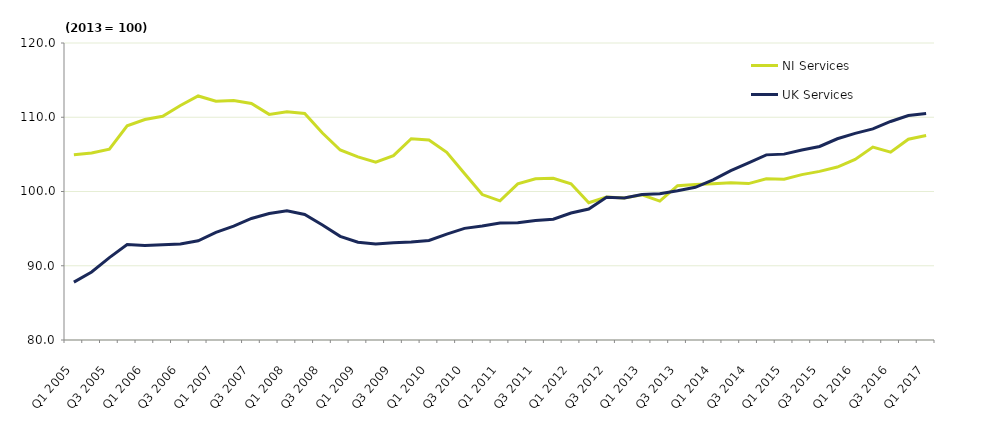
| Category | NI Services | UK Services |
|---|---|---|
| Q1 2005 | 104.955 | 87.8 |
| Q2 2005 | 105.184 | 89.167 |
| Q3 2005 | 105.7 | 91.1 |
| Q4 2005 | 108.843 | 92.867 |
| Q1 2006 | 109.689 | 92.733 |
| Q2 2006 | 110.137 | 92.833 |
| Q3 2006 | 111.588 | 92.933 |
| Q4 2006 | 112.865 | 93.367 |
| Q1 2007 | 112.163 | 94.5 |
| Q2 2007 | 112.244 | 95.333 |
| Q3 2007 | 111.863 | 96.367 |
| Q4 2007 | 110.384 | 97.033 |
| Q1 2008 | 110.753 | 97.4 |
| Q2 2008 | 110.5 | 96.9 |
| Q3 2008 | 107.875 | 95.5 |
| Q4 2008 | 105.593 | 93.967 |
| Q1 2009 | 104.653 | 93.167 |
| Q2 2009 | 103.947 | 92.933 |
| Q3 2009 | 104.837 | 93.1 |
| Q4 2009 | 107.108 | 93.2 |
| Q1 2010 | 106.935 | 93.4 |
| Q2 2010 | 105.287 | 94.267 |
| Q3 2010 | 102.435 | 95.033 |
| Q4 2010 | 99.586 | 95.367 |
| Q1 2011 | 98.737 | 95.767 |
| Q2 2011 | 101.024 | 95.8 |
| Q3 2011 | 101.708 | 96.1 |
| Q4 2011 | 101.784 | 96.267 |
| Q1 2012 | 101.051 | 97.1 |
| Q2 2012 | 98.48 | 97.633 |
| Q3 2012 | 99.257 | 99.233 |
| Q4 2012 | 99.117 | 99.133 |
| Q1 2013 | 99.545 | 99.6 |
| Q2 2013 | 98.706 | 99.7 |
| Q3 2013 | 100.791 | 100.1 |
| Q4 2013 | 100.958 | 100.567 |
| Q1 2014 | 101.039 | 101.567 |
| Q2 2014 | 101.172 | 102.8 |
| Q3 2014 | 101.066 | 103.867 |
| Q4 2014 | 101.709 | 104.933 |
| Q1 2015 | 101.661 | 105.033 |
| Q2 2015 | 102.27 | 105.6 |
| Q3 2015 | 102.71 | 106.067 |
| Q4 2015 | 103.293 | 107.1 |
| Q1 2016 | 104.318 | 107.833 |
| Q2 2016 | 105.981 | 108.433 |
| Q3 2016 | 105.305 | 109.433 |
| Q4 2016 | 107.043 | 110.233 |
| Q1 2017 | 107.539 | 110.5 |